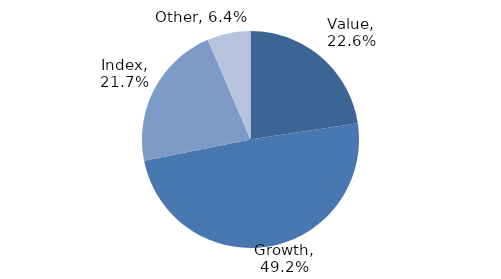
| Category | Investment Style |
|---|---|
| Value | 0.226 |
| Growth | 0.492 |
| Index | 0.217 |
| Other | 0.064 |